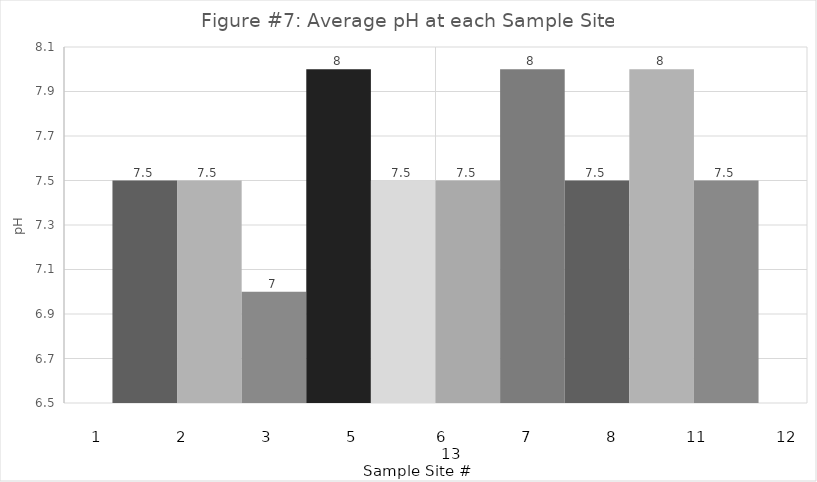
| Category | Series 0 | Series 1 | Series 2 | Series 3 | Series 4 | Series 5 | Series 6 | Series 7 | Series 8 | Series 9 |
|---|---|---|---|---|---|---|---|---|---|---|
| 0 | 7.5 | 7.5 | 7 | 8 | 7.5 | 7.5 | 8 | 7.5 | 8 | 7.5 |